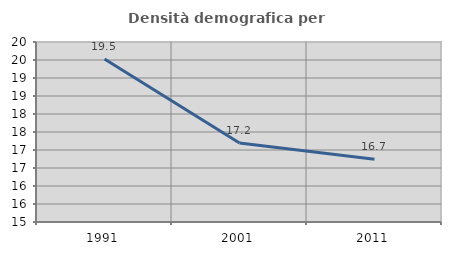
| Category | Densità demografica |
|---|---|
| 1991.0 | 19.526 |
| 2001.0 | 17.193 |
| 2011.0 | 16.743 |